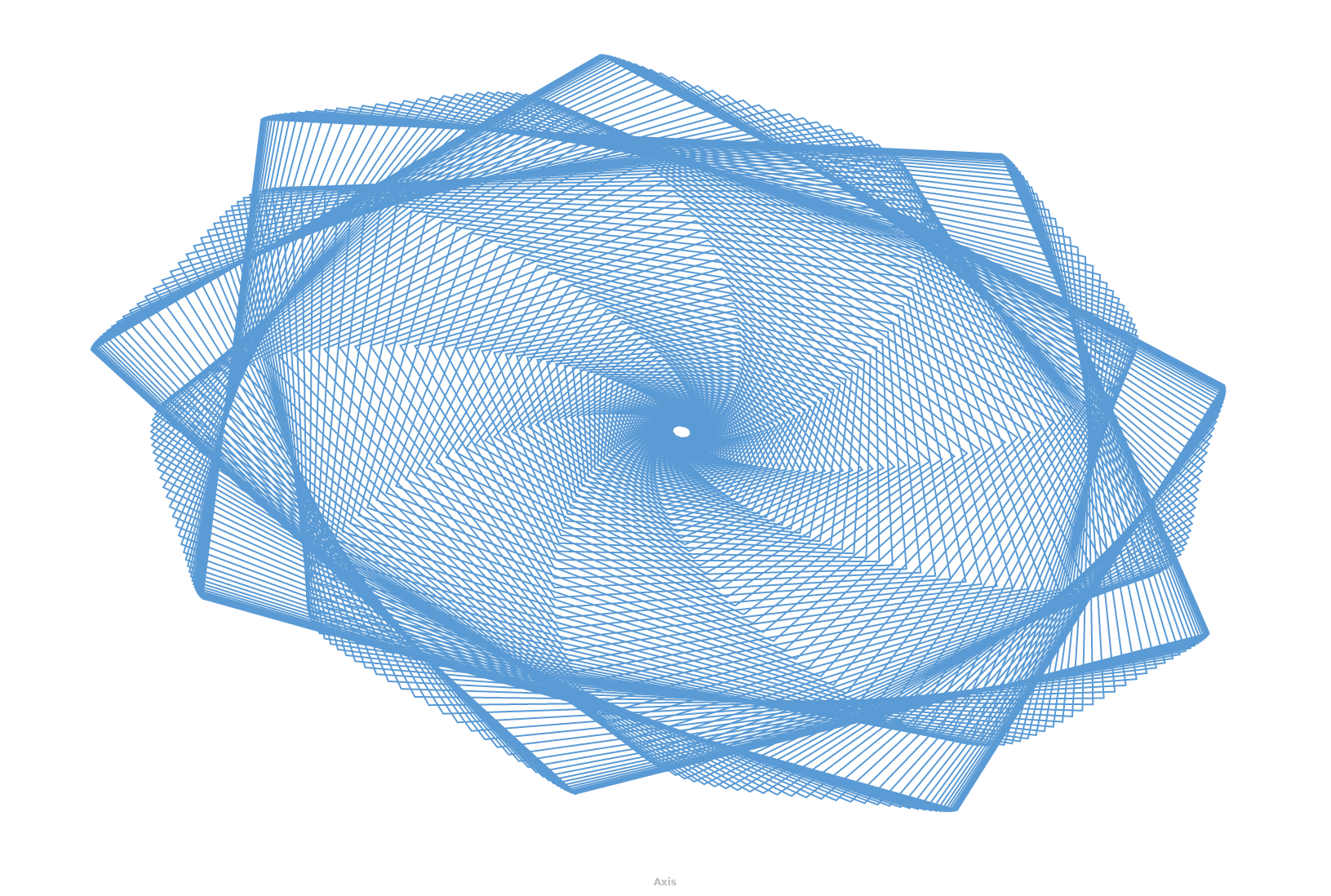
| Category | y |
|---|---|
| 0.0 | 0 |
| 0.0 | 0 |
| -0.04 | 0 |
| -0.02 | -0.04 |
| 0.0108 | -0.034 |
| 0.009584000000000002 | -0.002 |
| -0.0262760128 | 0.009 |
| -0.035350763962675204 | -0.023 |
| -0.0031084073654254925 | -0.044 |
| 0.017635728670052545 | -0.019 |
| -0.008096546118139446 | 0.011 |
| -0.037877363241053244 | -0.004 |
| -0.022086237732677642 | -0.039 |
| 0.013516186521497563 | -0.036 |
| 0.00977021201874044 | 0 |
| -0.027571768701006038 | 0.01 |
| -0.036645580909709256 | -0.024 |
| -0.0019140912986825055 | -0.045 |
| 0.019187564785462075 | -0.018 |
| -0.008685763537805279 | 0.013 |
| -0.039694916290889365 | -0.004 |
| -0.02209326007285622 | -0.041 |
| 0.01534242991979582 | -0.037 |
| 0.010412073024101114 | 0.002 |
| -0.029204087084261664 | 0.011 |
| -0.03785684987708708 | -0.025 |
| -0.0006770144601839813 | -0.047 |
| 0.020837906078379865 | -0.018 |
| -0.009368594860134215 | 0.015 |
| -0.04160467640824957 | -0.004 |
| -0.02205615206850274 | -0.043 |
| 0.017286670532407074 | -0.038 |
| 0.011045097097503363 | 0.004 |
| -0.030956786060506933 | 0.012 |
| -0.03910166789846849 | -0.026 |
| 0.0006710111678276884 | -0.049 |
| 0.022559921005381657 | -0.017 |
| -0.010138770947629102 | 0.016 |
| -0.04361753160831021 | -0.004 |
| -0.02196565094868741 | -0.045 |
| 0.019353228140468384 | -0.038 |
| 0.011666483265624653 | 0.006 |
| -0.03283770331595295 | 0.014 |
| -0.0403787086274196 | -0.028 |
| 0.002137784403206767 | -0.05 |
| 0.024355244553093236 | -0.016 |
| -0.01100376805846125 | 0.019 |
| -0.04573767325172911 | -0.004 |
| -0.021815619535498244 | -0.047 |
| 0.021548415287355835 | -0.039 |
| 0.01227223287056084 | 0.008 |
| -0.034854659158973594 | 0.015 |
| -0.04168658146306721 | -0.029 |
| 0.003731677740649645 | -0.052 |
| 0.026225349872495998 | -0.015 |
| -0.011971552499308962 | 0.021 |
| -0.04796936942496159 | -0.004 |
| -0.021599413429923164 | -0.05 |
| 0.023878772423761567 | -0.039 |
| 0.01285792768596547 | 0.01 |
| -0.037015860957603064 | 0.016 |
| -0.04302359608607553 | -0.031 |
| 0.00546155149556822 | -0.054 |
| 0.028171578628853194 | -0.014 |
| -0.01305063282670037 | 0.023 |
| -0.05031694287954459 | -0.005 |
| -0.021309854334650526 | -0.052 |
| 0.02635107141135195 | -0.04 |
| 0.013418695880669754 | 0.012 |
| -0.03932991491311735 | 0.018 |
| -0.04438773326385598 | -0.033 |
| 0.007336775704986455 | -0.056 |
| 0.030195119342356372 | -0.013 |
| -0.014250089997162148 | 0.026 |
| -0.052784759357719986 | -0.005 |
| -0.020939195344646853 | -0.055 |
| 0.02897231493200897 | -0.041 |
| 0.013949177378736514 | 0.014 |
| -0.041805838268977116 | 0.019 |
| -0.04577661307290856 | -0.035 |
| 0.009367252192646301 | -0.058 |
| 0.03229698384807338 | -0.012 |
| -0.015579608730952838 | 0.028 |
| -0.055377214236717535 | -0.005 |
| -0.020479084524886625 | -0.057 |
| 0.03174973478341399 | -0.041 |
| 0.014443487112998931 | 0.017 |
| -0.04445307116689878 | 0.021 |
| -0.0471874607757905 | -0.037 |
| 0.011563436908577411 | -0.061 |
| 0.03447798165190685 | -0.01 |
| -0.01704951003396427 | 0.031 |
| -0.05809871735968554 | -0.006 |
| -0.01992052673622495 | -0.06 |
| 0.03469078891523043 | -0.042 |
| 0.014895176090327564 | 0.02 |
| -0.04728148803580279 | 0.022 |
| -0.04861707021968233 | -0.039 |
| 0.013936362448561071 | -0.063 |
| 0.036738692041108606 | -0.009 |
| -0.018670784850856038 | 0.034 |
| -0.06095367588895655 | -0.007 |
| -0.019253843691697588 | -0.063 |
| 0.03780315705251629 | -0.042 |
| 0.015297190187469847 | 0.023 |
| -0.05030140838234663 | 0.023 |
| -0.05006176462150959 | -0.042 |
| 0.016497660641417722 | -0.065 |
| 0.03907943380172339 | -0.007 |
| -0.020455128807830528 | 0.037 |
| -0.0639464750053593 | -0.007 |
| -0.018468632238111668 | -0.067 |
| 0.04109473473883609 | -0.042 |
| 0.01564182660100867 | 0.026 |
| -0.053523606834003715 | 0.025 |
| -0.05151735460290531 | -0.045 |
| 0.01925958507165449 | -0.068 |
| 0.04150023238962207 | -0.005 |
| -0.022414977986025098 | 0.04 |
| -0.06708145626465434 | -0.008 |
| -0.017553720873344683 | -0.07 |
| 0.044573625616245824 | -0.043 |
| 0.01592068788167351 | 0.029 |
| -0.05695932226576867 | 0.026 |
| -0.05297909333790261 | -0.047 |
| 0.02223503338171058 | -0.07 |
| 0.04400078439652615 | -0.003 |
| -0.02456354564573208 | 0.043 |
| -0.07036289340893272 | -0.009 |
| -0.016497124528823473 | -0.074 |
| 0.04824813174279931 | -0.043 |
| 0.01612463349235215 | 0.033 |
| -0.060620265819312846 | 0.028 |
| -0.05444162867747776 | -0.051 |
| 0.02543756917144034 | -0.073 |
| 0.04658041914781226 | -0.001 |
| -0.026914859796984617 | 0.046 |
| -0.07379496541700512 | -0.01 |
| -0.015285997669845255 | -0.077 |
| 0.05212674173038727 | -0.043 |
| 0.01624372884122189 | 0.037 |
| -0.06451862759850759 | 0.029 |
| -0.055898952118354654 | -0.054 |
| 0.02888144328213136 | -0.075 |
| 0.04923805726514339 | 0.002 |
| -0.029483801482804287 | 0.05 |
| -0.07738172656347006 | -0.012 |
| -0.013906585794470062 | -0.082 |
| 0.056218116466477355 | -0.043 |
| 0.01626719175707445 | 0.041 |
| -0.06866708179737743 | 0.031 |
| -0.05734434448934855 | -0.058 |
| 0.03258161421776625 | -0.078 |
| 0.05197216602438597 | 0.004 |
| -0.03228614360682584 | 0.054 |
| -0.08112707324135211 | -0.013 |
| -0.012344175445521334 | -0.086 |
| 0.060531072162578185 | -0.043 |
| 0.016183336393902438 | 0.045 |
| -0.07307878998540697 | 0.032 |
| -0.05877031823760068 | -0.061 |
| 0.03655376741683172 | -0.081 |
| 0.05478071133817506 | 0.007 |
| -0.03533859009620553 | 0.057 |
| -0.08503470728803729 | -0.015 |
| -0.010583042890780669 | -0.09 |
| 0.06507456044990287 | -0.043 |
| 0.01597951457704283 | 0.05 |
| -0.07776740224033732 | 0.034 |
| -0.06016855621009033 | -0.066 |
| 0.04081433304311628 | -0.084 |
| 0.057661106193293635 | 0.011 |
| -0.038658815142657704 | 0.061 |
| -0.08910809553882261 | -0.017 |
| -0.00860640167491146 | -0.095 |
| 0.06985764521864551 | -0.043 |
| 0.015642054634699566 | 0.054 |
| -0.0827470557797449 | 0.035 |
| -0.061529846843715166 | -0.07 |
| 0.04538050191289164 | -0.087 |
| 0.06061015537622859 | 0.014 |
| -0.042265502207969305 | 0.066 |
| -0.09335042531689978 | -0.019 |
| -0.006396349304330376 | -0.1 |
| 0.0748894758713949 | -0.042 |
| 0.015156197797756902 | 0.06 |
| -0.08803237069934523 | 0.037 |
| -0.06284401570108716 | -0.075 |
| 0.050270239117819686 | -0.09 |
| 0.06362399632644014 | 0.018 |
| -0.04617838241406012 | 0.07 |
| -0.09776455555320161 | -0.021 |
| -0.00393381339470187 | -0.105 |
| 0.08017925663336457 | -0.042 |
| 0.014506032298941842 | 0.065 |
| -0.09363844237761049 | 0.038 |
| -0.06409985332029575 | -0.08 |
| 0.05550229483693923 | -0.093 |
| 0.0666980359667336 | 0.022 |
| -0.05041827186004279 | 0.075 |
| -0.10235296321450091 | -0.024 |
| -0.0011984976917143314 | -0.111 |
| 0.08573621153218342 | -0.041 |
| 0.013674425361360237 | 0.071 |
| -0.09958083005237313 | 0.039 |
| -0.06528503938677245 | -0.085 |
| 0.06109621175610863 | -0.096 |
| 0.06982688337447557 | 0.027 |
| -0.055007107318029734 | 0.079 |
| -0.10711768470375968 | -0.026 |
| 0.001831171528690178 | -0.117 |
| 0.09156954462781132 | -0.04 |
| 0.012642953338288396 | 0.077 |
| -0.105875541014987 | 0.04 |
| -0.06638606328587107 | -0.091 |
| 0.06707232842811735 | -0.099 |
| 0.0730042781772221 | 0.031 |
| -0.059967979653639855 | 0.084 |
| -0.11206025188333875 | -0.03 |
| 0.005178098062150079 | -0.123 |
| 0.09768839503854991 | -0.039 |
| 0.01139183035327683 | 0.084 |
| -0.11253900980062553 | 0.042 |
| -0.06738814115798512 | -0.098 |
| 0.07345177780997048 | -0.103 |
| 0.07622301458275585 | 0.037 |
| -0.06532516419402493 | 0.089 |
| -0.11718162235971721 | -0.033 |
| 0.008866566629637692 | -0.129 |
| 0.10410178627190902 | -0.038 |
| 0.009899835894943823 | 0.091 |
| -0.11958807167861435 | 0.043 |
| -0.068275129656465 | -0.104 |
| 0.08025648010404786 | -0.106 |
| 0.07947486098787897 | 0.042 |
| -0.07110414712324295 | 0.095 |
| -0.12248210365833387 | -0.037 |
| 0.012922291079118318 | -0.136 |
| 0.11081856932902868 | -0.036 |
| 0.008144241947586488 | 0.098 |
| -0.12703992966339558 | 0.043 |
| -0.06902943670518062 | -0.111 |
| 0.08750912890517118 | -0.109 |
| 0.08275047515408808 | 0.048 |
| -0.0773316468191392 | 0.1 |
| -0.12796127090961917 | -0.041 |
| 0.01737245885185712 | -0.143 |
| 0.11784735900815645 | -0.034 |
| 0.006100740390702734 | 0.106 |
| -0.13491211417372914 | 0.044 |
| -0.06963192967067305 | -0.119 |
| 0.09523316951405554 | -0.112 |
| 0.08603931499319317 | 0.055 |
| -0.08403562885445084 | 0.106 |
| -0.13361787766288713 | -0.046 |
| 0.022245770422022332 | -0.15 |
| 0.12519646278598212 | -0.032 |
| 0.0037433715820372783 | 0.114 |
| -0.14322243436377724 | 0.045 |
| -0.07006184150732518 | -0.127 |
| 0.1034527681168503 | -0.116 |
| 0.0893295450739793 | 0.062 |
| -0.0912453131642216 | 0.112 |
| -0.13944975944422638 | -0.051 |
| 0.02757247217752072 | -0.158 |
| 0.13287380160497692 | -0.029 |
| 0.0010444552547648686 | 0.122 |
| -0.15198892003327052 | 0.045 |
| -0.07029667560726474 | -0.136 |
| 0.11219277034781931 | -0.119 |
| 0.09260793904430956 | 0.069 |
| -0.0989911716281155 | 0.118 |
| -0.145453729678654 | -0.057 |
| 0.0333843809326518 | -0.166 |
| 0.1408868218396774 | -0.026 |
| -0.0020254748845572636 | 0.131 |
| -0.16122975289317099 | 0.045 |
| -0.07031211029477191 | -0.145 |
| 0.12147864754460687 | -0.122 |
| 0.09585977826400344 | 0.077 |
| -0.1073049140259209 | 0.124 |
| -0.15162546760640888 | -0.063 |
| 0.03971489794498238 | -0.174 |
| 0.14924239765431413 | -0.023 |
| -0.005497731168458961 | 0.141 |
| -0.17096318581586822 | 0.045 |
| -0.07008190415333296 | -0.155 |
| 0.13133642876947046 | -0.126 |
| 0.0990687470649311 | 0.086 |
| -0.11621945999332751 | 0.13 |
| -0.1579593978391972 | -0.069 |
| 0.046599009945565206 | -0.183 |
| 0.1579467228972635 | -0.019 |
| -0.009405524547618251 | 0.151 |
| -0.1812074485321763 | 0.045 |
| -0.06957780366823202 | -0.165 |
| 0.1417926164013325 | -0.129 |
| 0.10221682519867578 | 0.095 |
| -0.12576889422876197 | 0.137 |
| -0.16444856122524237 | -0.077 |
| 0.054073274279123104 | -0.192 |
| 0.16700519160311364 | -0.015 |
| -0.013784007277713825 | 0.162 |
| -0.1919806380477786 | 0.044 |
| -0.06876945501521356 | -0.176 |
| 0.1528740827980037 | -0.132 |
| 0.10528417820145411 | 0.105 |
| -0.13598840177661897 | 0.143 |
| -0.17108447672277188 | -0.084 |
| 0.06217578478536253 | -0.201 |
| 0.17642226608881512 | -0.01 |
| -0.018670302773070448 | 0.173 |
| -0.20330059183499308 | 0.043 |
| -0.06762432223305703 | -0.188 |
| 0.1646079451804806 | -0.135 |
| 0.10824904660316122 | 0.116 |
| -0.14691417973396614 | 0.15 |
| -0.17785699402044236 | -0.093 |
| 0.0709461145312478 | -0.211 |
| 0.18620133153397467 | -0.005 |
| -0.024103519129620186 | 0.184 |
| -0.21518474160650022 | 0.042 |
| -0.0661076144916439 | -0.2 |
| 0.17702141549649864 | -0.138 |
| 0.11108763513437223 | 0.127 |
| -0.15858332119392232 | 0.157 |
| -0.18475413669003685 | -0.102 |
| 0.0804252309253434 | -0.222 |
| 0.19634453582359904 | 0.001 |
| -0.030124742182773535 | 0.197 |
| -0.22764994518951098 | 0.041 |
| -0.06418222571353038 | -0.213 |
| 0.1901416215731716 | -0.141 |
| 0.11377400334295233 | 0.139 |
| -0.17103366664813982 | 0.164 |
| -0.19176193571070305 | -0.112 |
| 0.09065537810995988 | -0.232 |
| 0.20685261330034332 | 0.007 |
| -0.036777003244110734 | 0.209 |
| -0.24071229368403602 | 0.039 |
| -0.06180869043124959 | -0.227 |
| 0.20399539536375916 | -0.143 |
| 0.11627995932026175 | 0.152 |
| -0.18430361742448606 | 0.171 |
| -0.1988642532631012 | -0.123 |
| 0.10167992083904898 | -0.243 |
| 0.21772469091734423 | 0.014 |
| -0.04410521585341792 | 0.223 |
| -0.25438689069853987 | 0.036 |
| -0.058945160467371666 | -0.241 |
| 0.21860902352815692 | -0.146 |
| 0.11857495855326428 | 0.166 |
| -0.19843190503962568 | 0.178 |
| -0.2060425967526878 | -0.134 |
| 0.11354314331902979 | -0.254 |
| 0.22895807509579008 | 0.022 |
| -0.052156074994031604 | 0.237 |
| -0.26868760000065156 | 0.033 |
| -0.05554740780883932 | -0.257 |
| 0.23400795496073407 | -0.148 |
| 0.12062601025753238 | 0.181 |
| -0.213457309611835 | 0.186 |
| -0.21327592307868026 | -0.147 |
| 0.12628999573309393 | -0.266 |
| 0.24054801736655793 | 0.031 |
| -0.060977911262743816 | 0.252 |
| -0.2836267573902931 | 0.03 |
| -0.05156885990450597 | -0.273 |
| 0.2502164591989568 | -0.15 |
| 0.12239759389728501 | 0.196 |
| -0.22941831972920207 | 0.193 |
| -0.22054043321152253 | -0.16 |
| 0.13996578041512547 | -0.278 |
| 0.2524874566057989 | 0.04 |
| -0.07062049148626243 | 0.267 |
| -0.2992148419903355 | 0.025 |
| -0.046960674529754956 | -0.29 |
| 0.2672572289286873 | -0.151 |
| 0.12385158894684097 | 0.213 |
| -0.2463527254396818 | 0.2 |
| -0.22780935716720674 | -0.174 |
| 0.1546157689307681 | -0.291 |
| 0.2647667353556485 | 0.05 |
| -0.08113475627797226 | 0.283 |
| -0.3154601014542452 | 0.021 |
| -0.04167186230699038 | -0.308 |
| 0.2851509190810435 | -0.153 |
| 0.12494722127135208 | 0.23 |
| -0.26429713538178334 | 0.208 |
| -0.2350527294604759 | -0.189 |
| 0.1702847407252712 | -0.303 |
| 0.2773732873543495 | 0.061 |
| -0.09257248409970253 | 0.299 |
| -0.33236812482150635 | 0.015 |
| -0.035649465901607655 | -0.327 |
| 0.30391561435154263 | -0.153 |
| 0.12564102977475605 | 0.249 |
| -0.2832864085991434 | 0.215 |
| -0.24223715507045676 | -0.206 |
| 0.18701643360390122 | -0.316 |
| 0.29029129299798484 | 0.073 |
| -0.10498587063392646 | 0.317 |
| -0.3499413559415795 | 0.009 |
| -0.028838805764640874 | -0.347 |
| 0.32356621646439787 | -0.154 |
| 0.12588685714554496 | 0.268 |
| -0.30335299141381666 | 0.222 |
| -0.24932556585712295 | -0.223 |
| 0.20485289625081352 | -0.33 |
| 0.30350129905373546 | 0.086 |
| -0.1184270118230498 | 0.335 |
| -0.3681785396030793 | 0.002 |
| -0.021183802975391557 | -0.367 |
| 0.3441137423084803 | -0.153 |
| 0.12563586859158746 | 0.289 |
| -0.3245261500646113 | 0.23 |
| -0.2562769672357123 | -0.242 |
| 0.22383373344060228 | -0.343 |
| 0.3169797986146259 | 0.1 |
| -0.13294727898107755 | 0.353 |
| -0.38707409186984004 | -0.006 |
| -0.012627390132924288 | -0.389 |
| 0.36556452441737874 | -0.153 |
| 0.12483660236923648 | 0.311 |
| -0.3468310909134074 | 0.237 |
| -0.2630461747905539 | -0.262 |
| 0.24399523577697943 | -0.357 |
| 0.3306987671606052 | 0.115 |
| -0.14859657516242045 | 0.372 |
| -0.40661738584558027 | -0.015 |
| -0.0031120212143289083 | -0.412 |
| 0.3879193064817457 | -0.151 |
| 0.1234350556845725 | 0.333 |
| -0.3702879622324289 | 0.243 |
| -0.2695835404886541 | -0.283 |
| 0.2653693879760988 | -0.371 |
| 0.3446251508934353 | 0.132 |
| -0.16542246375172742 | 0.392 |
| -0.4267919444858746 | -0.024 |
| 0.00741970928887354 | -0.436 |
| 0.411172229109801 | -0.149 |
| 0.12137480924460779 | 0.357 |
| -0.3949107353399326 | 0.25 |
| -0.2758346684321785 | -0.305 |
| 0.287982753199357 | -0.386 |
| 0.35872030459433824 | 0.149 |
| -0.18346916329010599 | 0.412 |
| -0.4475745336238578 | -0.035 |
| 0.01902432895372291 | -0.46 |
| 0.435309705453734 | -0.147 |
| 0.11859719354773826 | 0.383 |
| -0.42070596864083987 | 0.256 |
| -0.2817401210143192 | -0.328 |
| 0.3118552360223664 | -0.4 |
| 0.3729393786344826 | 0.168 |
| -0.20277640709033898 | 0.433 |
| -0.46893415173078956 | -0.047 |
| 0.03175662478586468 | -0.486 |
| 0.4603091932573239 | -0.143 |
| 0.11504150029843108 | 0.409 |
| -0.44767146643723355 | 0.262 |
| -0.28723511848338656 | -0.353 |
| 0.33699873350320997 | -0.414 |
| 0.3872306591749551 | 0.188 |
| -0.2233781722642928 | 0.455 |
| -0.490830918943482 | -0.06 |
| 0.04566865110849537 | -0.512 |
| 0.4861378800463613 | -0.139 |
| 0.1106452437648422 | 0.436 |
| -0.4757948555539614 | 0.268 |
| -0.29224923914461465 | -0.379 |
| 0.3634156924646491 | -0.429 |
| 0.4015348729662873 | 0.209 |
| -0.24530129011402146 | 0.477 |
| -0.5132148775655807 | -0.074 |
| 0.060808606656493784 | -0.54 |
| 0.5127513121626471 | -0.133 |
| 0.10534448050261103 | 0.465 |
| -0.5050521168867045 | 0.273 |
| -0.29670613497726395 | -0.407 |
| 0.39109760110900077 | -0.443 |
| 0.41578447960997206 | 0.232 |
| -0.26856395762441015 | 0.499 |
| -0.5360247306429368 | -0.089 |
| 0.07721958187640289 | -0.568 |
| 0.540092016372703 | -0.127 |
| 0.09907420312511926 | 0.494 |
| -0.5354061252869831 | 0.277 |
| -0.30052328994535116 | -0.436 |
| 0.42002345339070135 | -0.457 |
| 0.4299029908137159 | 0.255 |
| -0.29317417650861316 | 0.522 |
| -0.5591865651944897 | -0.105 |
| 0.09493817778479294 | -0.597 |
| 0.5680881844094966 | -0.12 |
| 0.09176883661613172 | 0.525 |
| -0.5668052680904652 | 0.281 |
| -0.3036118676583046 | -0.466 |
| 0.45015823328969995 | -0.471 |
| 0.44380437892368557 | 0.28 |
| -0.31912814951022245 | 0.545 |
| -0.5826126325508464 | -0.123 |
| 0.1139929941996655 | -0.627 |
| 0.5966525144469564 | -0.112 |
| 0.08336288615953767 | 0.556 |
| -0.5991822270170754 | 0.284 |
| -0.30587672320420645 | -0.497 |
| 0.4814514704377277 | -0.485 |
| 0.45739266593895256 | 0.307 |
| -0.3464086603270643 | 0.568 |
| -0.6062002892024873 | -0.142 |
| 0.13440297552940492 | -0.657 |
| 0.6256813260078365 | -0.102 |
| 0.07379181532724197 | 0.589 |
| -0.632453015475608 | 0.286 |
| -0.30721669218023906 | -0.53 |
| 0.513835914913585 | -0.498 |
| 0.47056181788397233 | 0.335 |
| -0.3749834502997698 | 0.591 |
| -0.6298312350107109 | -0.162 |
| 0.15617558481970756 | -0.688 |
| 0.6550540811511918 | -0.092 |
| 0.06299327295900098 | 0.622 |
| -0.6665163574923684 | 0.287 |
| -0.307525317640914 | -0.563 |
| 0.5472263639638784 | -0.51 |
| 0.48319610398636403 | 0.364 |
| -0.4048035797709071 | 0.614 |
| -0.6533712166216241 | -0.184 |
| 0.17930475150772254 | -0.72 |
| 0.6846334482349414 | -0.08 |
| 0.050908833172497614 | 0.656 |
| -0.7012534692365993 | 0.287 |
| -0.30669222886306224 | -0.598 |
| 0.581518645076986 | -0.522 |
| 0.495171108371446 | 0.394 |
| -0.43580172603551376 | 0.637 |
| -0.6766703847660998 | -0.207 |
| 0.20376850944308134 | -0.751 |
| 0.7142660275110998 | -0.067 |
| 0.03748645698312207 | 0.69 |
| -0.7365282549649915 | 0.286 |
| -0.30460543483664404 | -0.634 |
| 0.61658872052212 | -0.533 |
| 0.5063555927536733 | 0.425 |
| -0.46789033081095044 | 0.659 |
| -0.6995644947540166 | -0.231 |
| 0.22952622013476234 | -0.783 |
| 0.7437838137610395 | -0.052 |
| 0.02268390899281502 | 0.725 |
| -0.7721878569446211 | 0.284 |
| -0.3011548226542749 | -0.67 |
| 0.652291837702315 | -0.542 |
| 0.5166143869233768 | 0.457 |
| -0.5009594855709678 | 0.681 |
| -0.7218771087609817 | -0.256 |
| 0.2565152820588925 | -0.814 |
| 0.7730063976905295 | -0.037 |
| 0.006473341299391457 | 0.76 |
| -0.8080634138754524 | 0.28 |
| -0.29623712945278313 | -0.707 |
| 0.6884616270434596 | -0.551 |
| 0.525812412699457 | 0.49 |
| -0.5348744617258734 | 0.702 |
| -0.7434228869038376 | -0.282 |
| 0.28464729003185457 | -0.845 |
| 0.8017438103488771 | -0.02 |
| -0.0111528474990834 | 0.795 |
| -0.8439708083195248 | 0.275 |
| -0.28976255059477074 | -0.745 |
| 0.7249090747280653 | -0.558 |
| 0.5338198113789064 | 0.524 |
| -0.5694728921566267 | 0.722 |
| -0.7640119374050961 | -0.309 |
| 0.3138037639999861 | -0.875 |
| 0.8297998102867045 | -0.001 |
| -0.030174997318701033 | 0.829 |
| -0.879711159084165 | 0.268 |
| -0.28166291777982694 | -0.783 |
| 0.7614214070595673 | -0.564 |
| 0.5405179381880553 | 0.559 |
| -0.6045618272143226 | 0.742 |
| -0.7834550399330801 | -0.338 |
| 0.3438318412857537 | -0.905 |
| 0.8569753311147605 | 0.018 |
| -0.0505385117820436 | 0.863 |
| -0.9150708873531185 | 0.26 |
| -0.27190100093327735 | -0.821 |
| 0.7977611443373539 | -0.568 |
| 0.5458057215680929 | 0.593 |
| -0.6399152356276169 | 0.759 |
| -0.8015693797610097 | -0.367 |
| 0.3745407168617172 | -0.934 |
| 0.883071786265382 | 0.038 |
| -0.07214653524433022 | 0.897 |
| -0.9498213977374519 | 0.251 |
| -0.2604799640667867 | -0.86 |
| 0.8336659109142024 | -0.57 |
| 0.5496056004896 | 0.628 |
| -0.675272959180267 | 0.776 |
| -0.8181842683477334 | -0.396 |
| 0.40570005848154905 | -0.961 |
| 0.9078940043705244 | 0.06 |
| -0.09485456267305845 | 0.929 |
| -0.9837187758916681 | 0.24 |
| -0.2474514120863357 | -0.897 |
| 0.868849959558863 | -0.571 |
| 0.5518680245003815 | 0.663 |
| -0.7103425363162297 | 0.791 |
| -0.8331462251180224 | -0.426 |
| 0.43704196893937247 | -0.986 |
| 0.9312527559357784 | 0.082 |
| -0.11846900294081011 | 0.961 |
| -1.0165043521525532 | 0.227 |
| -0.2329199723029453 | -0.935 |
| 0.903008636111355 | -0.569 |
| 0.5525734330396402 | 0.698 |
| -0.7448054710388996 | 0.804 |
| -0.8463228038677093 | -0.455 |
| 0.46826809135007125 | -1.01 |
| 0.952967094423464 | 0.105 |
| -0.14275175526828282 | 0.991 |
| -1.0479073591215224 | 0.214 |
| -0.21704222186104222 | -0.971 |
| 0.9358269634624896 | -0.567 |
| 0.5517308276940244 | 0.732 |
| -0.7783291877662487 | 0.815 |
| -0.8576046956291278 | -0.485 |
| 0.49906292322655027 | -1.032 |
| 0.9728669723641891 | 0.127 |
| -0.16743222611746833 | 1.019 |
| -1.077650982255212 | 0.199 |
| -0.20001827892887228 | -1.006 |
| 0.9669929652052712 | -0.562 |
| 0.54937256570698 | 0.765 |
| -0.8105849166775048 | 0.825 |
| -0.8669059166905714 | -0.514 |
| 0.5291132206996665 | -1.052 |
| 0.9907966586034449 | 0.15 |
| -0.19222680454647015 | 1.045 |
| -1.1054626358864317 | 0.184 |
| -0.18207566043893111 | -1.039 |
| 0.9962152349407047 | -0.556 |
| 0.5455457724439061 | 0.796 |
| -0.8412701911410262 | 0.832 |
| -0.874162228326116 | -0.542 |
| 0.558131720535101 | -1.069 |
| 1.0066192512393775 | 0.173 |
| -0.21686386812240396 | 1.069 |
| -1.1310882282376615 | 0.168 |
| -0.16344688712137107 | -1.071 |
| 1.0232428266134534 | -0.549 |
| 0.5403015888320859 | 0.826 |
| -0.8701329582242489 | 0.838 |
| -0.8793282231424335 | -0.569 |
| 0.5858818059336082 | -1.084 |
| 1.0202220516178766 | 0.196 |
| -0.24111053924885645 | 1.091 |
| -1.1543087558436131 | 0.152 |
| -0.14434420746120494 | -1.1 |
| 1.0478843186024176 | -0.54 |
| 0.5336840410782293 | 0.853 |
| -0.8969932009831311 | 0.841 |
| -0.8823736466716263 | -0.594 |
| 0.6121988824902924 | -1.096 |
| 1.0315219264114586 | 0.218 |
| -0.26479645282280784 | 1.11 |
| -1.1749563433807293 | 0.135 |
| -0.12493592932131828 | -1.126 |
| 1.0700224879680642 | -0.53 |
| 0.525720396435328 | 0.879 |
| -0.9217580482900346 | 0.842 |
| -0.8832794649984717 | -0.619 |
| 0.6370046103733983 | -1.106 |
| 1.0404693583833884 | 0.239 |
| -0.2878302637690166 | 1.126 |
| -1.192926432993508 | 0.118 |
| -0.10532861942694732 | -1.151 |
| 1.0896217472574643 | -0.52 |
| 0.5164144015505355 | 0.903 |
| -0.9444277237041961 | 0.841 |
| -0.8820340018854489 | -0.642 |
| 0.6603117272484557 | -1.113 |
| 1.0470499434597622 | 0.26 |
| -0.3102064164941315 | 1.141 |
| -1.2081835306679711 | 0.1 |
| -0.08555788505341916 | -1.172 |
| 1.1067271539916728 | -0.507 |
| 0.5057429886802379 | 0.924 |
| -0.9650918642365605 | 0.838 |
| -0.87862927864005 | -0.663 |
| 0.6822193973835842 | -1.117 |
| 1.0512826675367917 | 0.28 |
| -0.3320020919885438 | 1.152 |
| -1.2207595028239158 | 0.083 |
| -0.06558824469422093 | -1.191 |
| 1.1214557654237804 | -0.494 |
| 0.4936562234528414 | 0.943 |
| -0.9839178726515211 | 0.833 |
| -0.873057607688847 | -0.684 |
| 0.7029009939593152 | -1.119 |
| 1.0532151548622168 | 0.3 |
| -0.35336630266759667 | 1.161 |
| -1.2307452354589286 | 0.065 |
| -0.04532062494255094 | -1.207 |
| 1.1339826491709313 | -0.48 |
| 0.48007975491622223 | 0.961 |
| -1.0011343160643664 | 0.826 |
| -0.8653085483495035 | -0.704 |
| 0.7225873245085923 | -1.119 |
| 1.0529168635226507 | 0.32 |
| -0.37450417013941556 | 1.168 |
| -1.2382778376382466 | 0.046 |
| -0.024604936613695852 | -1.222 |
| 1.1445245287217178 | -0.464 |
| 0.46491893257463907 | 0.977 |
| -1.017012661690013 | 0.817 |
| -0.8553664840392702 | -0.723 |
| 0.7415483691631444 | -1.116 |
| 1.0504716446561901 | 0.34 |
| -0.39565938118034616 | 1.173 |
| -1.2435261212208997 | 0.027 |
| -0.003255125351894879 | -1.234 |
| 1.1533238282603424 | -0.447 |
| 0.4480640079183208 | 0.992 |
| -1.031850026947242 | 0.805 |
| -0.8432092505642422 | -0.742 |
| 0.7600758631079243 | -1.11 |
| 1.045971116354281 | 0.36 |
| -0.4170969874866096 | 1.176 |
| -1.2466768583694372 | 0.006 |
| 0.018935216760187258 | -1.244 |
| 1.1606350857583831 | -0.429 |
| 0.42939627608674164 | 1.006 |
| -1.0459545388718265 | 0.792 |
| -0.8288083858570092 | -0.761 |
| 0.7784679480477013 | -1.103 |
| 1.039510039408511 | 0.381 |
| -0.43908756429354884 | 1.177 |
| -1.2479236106245244 | -0.015 |
| 0.04217758624650316 | -1.253 |
| 1.1667147129291042 | -0.409 |
| 0.40879547626439944 | 1.019 |
| -1.0596337589013762 | 0.776 |
| -0.8121316714118283 | -0.78 |
| 0.7970160285076784 | -1.093 |
| 1.0311844901955012 | 0.404 |
| -0.4618926632898145 | 1.176 |
| -1.2474590854099623 | -0.038 |
| 0.06667360953495638 | -1.261 |
| 1.1718141848953154 | -0.387 |
| 0.3861491450595507 | 1.032 |
| -1.0731856917170912 | 0.758 |
| -0.7931486995225917 | -0.8 |
| 0.8159931317395269 | -1.081 |
| 1.0210932362714469 | 0.427 |
| -0.4857507144038793 | 1.175 |
| -1.2454712473495688 | -0.063 |
| 0.0925996886004899 | -1.268 |
| 1.1761760719194831 | -0.364 |
| 0.3613648298592413 | 1.045 |
| -1.0868912550219363 | 0.738 |
| -0.7718402126937705 | -0.821 |
| 0.8356425792253236 | -1.068 |
| 1.0093423760794684 | 0.451 |
| -0.5108621476699128 | 1.172 |
| -1.2421428816099336 | -0.089 |
| 0.12009029004528318 | -1.274 |
| 1.1800318839665382 | -0.339 |
| 0.33438603856985527 | 1.058 |
| -1.1010067389045577 | 0.715 |
| -0.7482118542960469 | -0.843 |
| 0.856165659798594 | -1.052 |
| 0.9960529655980869 | 0.477 |
| -0.537372571695782 | 1.168 |
| -1.2376539452927318 | -0.117 |
| 0.14921913399467007 | -1.28 |
| 1.183600434903121 | -0.311 |
| 0.3052124042759303 | 1.071 |
| -1.1157547170375626 | 0.691 |
| -0.7223126041516581 | -0.867 |
| 0.8777072812791165 | -1.034 |
| 0.9813709310637143 | 0.505 |
| -0.5653534286984992 | 1.163 |
| -1.2321857630538355 | -0.147 |
| 0.17997831134618208 | -1.285 |
| 1.1870853133334467 | -0.283 |
| 0.2739236048101546 | 1.085 |
| -1.1313121329570743 | 0.665 |
| -0.6942573485965199 | -0.892 |
| 0.9003393405395714 | -1.015 |
| 0.9654779672187227 | 0.535 |
| -0.5947807405019393 | 1.158 |
| -1.2259258388882424 | -0.178 |
| 0.21225674673307784 | -1.29 |
| 1.1906701118613188 | -0.252 |
| 0.24070493892770545 | 1.1 |
| -1.1477950001329453 | 0.637 |
| -0.6642515539933193 | -0.919 |
| 0.9240428658494577 | -0.995 |
| 0.9486013259820988 | 0.566 |
| -0.6255143921369399 | 1.152 |
| -1.2190717401262452 | -0.211 |
| 0.24582135624044932 | -1.295 |
| 1.1945104546190382 | -0.22 |
| 0.20587015163630745 | 1.115 |
| -1.1652404840833488 | 0.607 |
| -0.632613848063759 | -0.947 |
| 0.9486917999144953 | -0.973 |
| 0.9310195593655608 | 0.598 |
| -0.6572826324548606 | 1.146 |
| -1.2118322481935397 | -0.245 |
| 0.2803063077493588 | -1.3 |
| 1.198722770290778 | -0.188 |
| 0.16987462135052292 | 1.131 |
| -1.183589109024529 | 0.577 |
| -0.5997898913669205 | -0.976 |
| 0.9740432236705957 | -0.951 |
| 0.9130607927452457 | 0.632 |
| -0.689678359942767 | 1.14 |
| -1.2044239974856212 | -0.279 |
| 0.315217038633597 | -1.305 |
| 1.2033712824421001 | -0.155 |
| 0.13331059018433253 | 1.148 |
| -1.2026720770516892 | 0.546 |
| -0.5663493996339122 | -1.006 |
| 0.9997399834833152 | -0.928 |
| 0.8950905930947636 | 0.665 |
| -0.7221739920806408 | 1.135 |
| -1.1970624751183494 | -0.314 |
| 0.349954768890276 | -1.31 |
| 1.2084565582380777 | -0.122 |
| 0.09687751289513429 | 1.165 |
| -1.2222101861003956 | 0.516 |
| -0.5329593432739963 | -1.036 |
| 1.025330828636035 | -0.906 |
| 0.877488523380285 | 0.699 |
| -0.7541588818390597 | 1.129 |
| -1.1899477651398325 | -0.348 |
| 0.3838631116536755 | -1.315 |
| 1.21391030996189 | -0.09 |
| 0.06132615411741748 | 1.182 |
| -1.2418300822526671 | 0.487 |
| -0.500331656926498 | -1.067 |
| 1.0503093959240968 | -0.884 |
| 0.8606159790015541 | 0.732 |
| -0.784997012632666 | 1.124 |
| -1.1832475747961932 | -0.38 |
| 0.4162914726948413 | -1.32 |
| 1.2196007478060364 | -0.059 |
| 0.02738399872923014 | 1.198 |
| -1.2610995249862538 | 0.459 |
| -0.469152621268089 | -1.096 |
| 1.0741672622911993 | -0.864 |
| 0.844781706408434 | 0.763 |
| -0.8140949997064809 | 1.12 |
| -1.1770819725404906 | -0.411 |
| 0.4466629420792485 | -1.325 |
| 1.2253499262057455 | -0.03 |
| -0.0043219590097278646 | 1.214 |
| -1.2795767553857136 | 0.433 |
| -0.44000964877425863 | -1.124 |
| 1.0964503845239943 | -0.845 |
| 0.8302134518066996 | 0.792 |
| -0.8409651753610852 | 1.115 |
| -1.171514615476667 | -0.439 |
| 0.47453122670527725 | -1.33 |
| 1.230960071931433 | -0.004 |
| -0.0333260810940526 | 1.229 |
| -1.296863019414077 | 0.409 |
| -0.4133341826004192 | -1.15 |
| 1.116805936694641 | -0.827 |
| 0.8170428485203751 | 0.819 |
| -0.8652691991611765 | 1.112 |
| -1.166553351763636 | -0.465 |
| 0.4996142011417292 | -1.334 |
| 1.2362422148345213 | 0.019 |
| -0.05935488047918082 | 1.243 |
| -1.3126454778934435 | 0.388 |
| -0.38937409604282414 | -1.173 |
| 1.135009542557094 | -0.812 |
| 0.8053062224911023 | 0.843 |
| -0.8868342828067761 | 1.109 |
| -1.1621597018045176 | -0.488 |
| 0.5217994931554116 | -1.338 |
| 1.2410397877742365 | 0.04 |
| -0.08232470460312176 | 1.256 |
| -1.3267214224481887 | 0.37 |
| -0.3681981496673938 | -1.194 |
| 1.1509696418875168 | -0.798 |
| 0.7949588045762936 | 0.864 |
| -0.9056430936003802 | 1.106 |
| -1.158263729949827 | -0.508 |
| 0.5411259659247586 | -1.341 |
| 1.2452424338002412 | 0.058 |
| -0.10231341157809085 | 1.266 |
| -1.3390016279483243 | 0.354 |
| -0.34972497758483545 | -1.212 |
| 1.1647125875874833 | -0.786 |
| 0.785896529956614 | 0.882 |
| -0.9218051699238533 | 1.103 |
| -1.1547797736922891 | -0.525 |
| 0.5577501737602903 | -1.344 |
| 1.2487892156959821 | 0.074 |
| -0.11951817771111184 | 1.275 |
| -1.3494969232041059 | 0.34 |
| -0.33376439100587657 | -1.227 |
| 1.1763560426997504 | -0.776 |
| 0.777979242173367 | 0.897 |
| -0.9355199865340689 | 1.101 |
| -1.151619497136979 | -0.539 |
| 0.5719077027881528 | -1.346 |
| 1.2516635664599483 | 0.087 |
| -0.13421100874578856 | 1.283 |
| -1.3582951282567777 | 0.328 |
| -0.3200597880678818 | -1.24 |
| 1.1860786439979787 | -0.767 |
| 0.7710508880799338 | 0.91 |
| -0.9470403061435718 | 1.099 |
| -1.1487006783056466 | -0.552 |
| 0.5838770437019111 | -1.347 |
| 1.2538836079888855 | 0.099 |
| -0.14669977719300245 | 1.289 |
| -1.3655353197117472 | 0.318 |
| -0.3083244584705055 | -1.251 |
| 1.194091910087025 | -0.759 |
| 0.7649546542276772 | 0.921 |
| -0.9566412074851267 | 1.096 |
| -1.1459518328387754 | -0.562 |
| 0.5939503099290863 | -1.348 |
| 1.2554911600281233 | 0.109 |
| -0.15729839054650013 | 1.295 |
| -1.3713843533480792 | 0.309 |
| -0.298268768943808 | -1.26 |
| 1.2006176560318964 | -0.752 |
| 0.7595428566323245 | 0.93 |
| -0.9645969896284271 | 1.094 |
| -1.1433136765804053 | -0.571 |
| 0.6024121886750324 | -1.349 |
| 1.256541684437791 | 0.117 |
| -0.16630654032157935 | 1.299 |
| -1.37601817790822 | 0.301 |
| -0.2896181773990221 | -1.268 |
| 1.2058718747015282 | -0.746 |
| 0.7546824184650514 | 0.937 |
| -0.9711658986694097 | 1.092 |
| -1.1407386145884995 | -0.578 |
| 0.6095265927755305 | -1.349 |
| 1.257096268630074 | 0.124 |
| -0.1739977223969696 | 1.302 |
| -1.3796085784863583 | 0.295 |
| -0.2821235572057431 | -1.274 |
| 1.2100545806570373 | -0.741 |
| 0.7502571057664886 | 0.943 |
| -0.9765814230319687 | 1.09 |
| -1.1381892362554389 | -0.584 |
| 0.6155295465758999 | -1.349 |
| 1.2572159025175047 | 0.13 |
| -0.1806135637704679 | 1.304 |
| -1.3823148387594202 | 0.289 |
| -0.2755657971418847 | -1.278 |
| 1.2133444293936182 | -0.736 |
| 0.7461676278017528 | 0.948 |
| -0.9810485043133752 | 1.088 |
| -1.1356364751870376 | -0.59 |
| 0.6206266053442041 | -1.348 |
| 1.2569578143049969 | 0.135 |
| -0.18636250332645626 | 1.306 |
| -1.3842793034734067 | 0.284 |
| -0.2697565358976372 | -1.282 |
| 1.2158967795271376 | -0.731 |
| 0.7423304811275622 | 0.953 |
| -0.9847430855047776 | 1.085 |
| -1.133057808653104 | -0.594 |
| 0.624993266649555 | -1.347 |
| 1.2563734279757806 | 0.14 |
| -0.19142119803048452 | 1.307 |
| -1.3856257373462952 | 0.279 |
| -0.2645365343470988 | -1.285 |
| 1.2178440109147335 | -0.727 |
| 0.7386761630542473 | 0.956 |
| -0.9878137067123433 | 1.083 |
| -1.1304356722129365 | -0.598 |
| 0.628777151780391 | -1.346 |
| 1.2555074809486082 | 0.144 |
| -0.19593743573511224 | 1.307 |
| -1.3864595119743868 | 0.275 |
| -0.2597727846987454 | -1.288 |
| 1.2192971689210248 | -0.723 |
| 0.7351471629837989 | 0.959 |
| -0.9903841964561745 | 1.08 |
| -1.127756145258312 | -0.601 |
| 0.6321010760583142 | -1.344 |
| 1.2543979036020785 | 0.148 |
| -0.20003371537993614 | 1.308 |
| -1.3868688681528967 | 0.271 |
| -0.2553550984368652 | -1.289 |